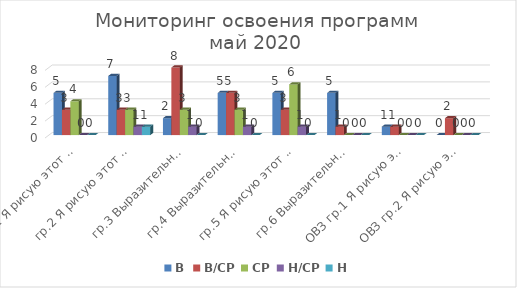
| Category | В | В/СР | СР | Н/СР | Н |
|---|---|---|---|---|---|
| гр.1 Я рисую этот мир | 5 | 3 | 4 | 0 | 0 |
| гр.2 Я рисую этот мир | 7 | 3 | 3 | 1 | 1 |
| гр.3 Выразительные возможности живописи и рисунка | 2 | 8 | 3 | 1 | 0 |
| гр.4 Выразительные возможности живописи и рисунка | 5 | 5 | 3 | 1 | 0 |
| гр.5 Я рисую этот мир | 5 | 3 | 6 | 1 | 0 |
| гр.6 Выразительные возможности живописи и рисунка | 5 | 1 | 0 | 0 | 0 |
| ОВЗ гр.1 Я рисую этот мир | 1 | 1 | 0 | 0 | 0 |
| ОВЗ гр.2 Я рисую этот мир | 0 | 2 | 0 | 0 | 0 |